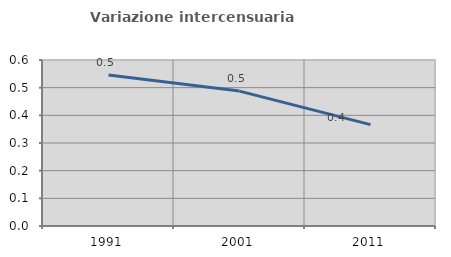
| Category | Variazione intercensuaria annua |
|---|---|
| 1991.0 | 0.546 |
| 2001.0 | 0.488 |
| 2011.0 | 0.366 |